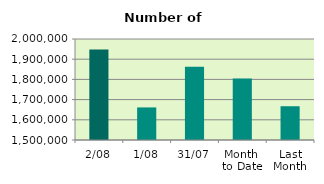
| Category | Series 0 |
|---|---|
| 2/08 | 1947682 |
| 1/08 | 1661280 |
| 31/07 | 1863114 |
| Month 
to Date | 1804481 |
| Last
Month | 1667155.905 |